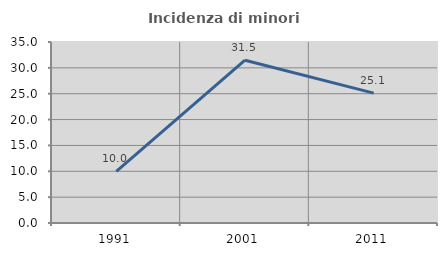
| Category | Incidenza di minori stranieri |
|---|---|
| 1991.0 | 10 |
| 2001.0 | 31.476 |
| 2011.0 | 25.105 |